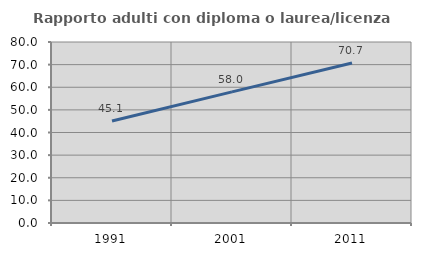
| Category | Rapporto adulti con diploma o laurea/licenza media  |
|---|---|
| 1991.0 | 45.103 |
| 2001.0 | 57.958 |
| 2011.0 | 70.717 |